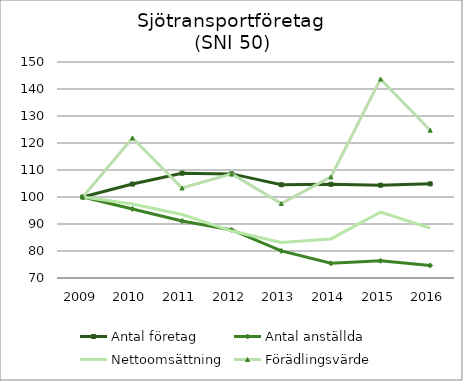
| Category | Antal företag | Antal anställda | Nettoomsättning | Förädlingsvärde |
|---|---|---|---|---|
| 2009.0 | 100 | 100 | 100 | 100 |
| 2010.0 | 104.786 | 95.559 | 97.397 | 121.863 |
| 2011.0 | 108.816 | 91.111 | 93.493 | 103.321 |
| 2012.0 | 108.564 | 87.8 | 87.38 | 108.577 |
| 2013.0 | 104.534 | 80.026 | 83.132 | 97.586 |
| 2014.0 | 104.702 | 75.439 | 84.475 | 107.447 |
| 2015.0 | 104.366 | 76.373 | 94.438 | 143.671 |
| 2016.0 | 104.87 | 74.644 | 88.449 | 124.72 |